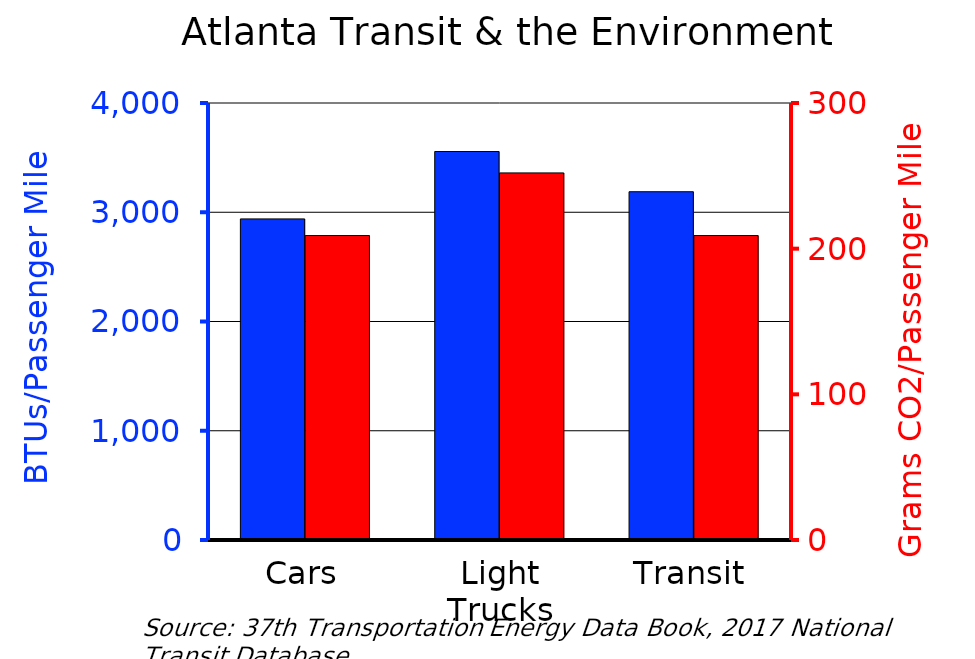
| Category | BTUs | Series 0 |
|---|---|---|
| Cars | 2939 |  |
| Light Trucks | 3556 |  |
| Transit | 3187.902 |  |